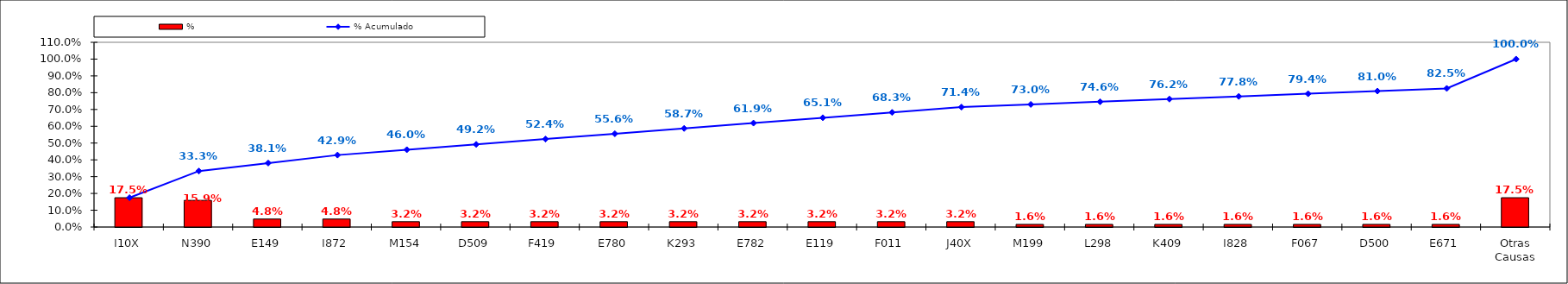
| Category | % |
|---|---|
| I10X | 0.175 |
| N390 | 0.159 |
| E149 | 0.048 |
| I872 | 0.048 |
| M154 | 0.032 |
| D509 | 0.032 |
| F419 | 0.032 |
| E780 | 0.032 |
| K293 | 0.032 |
| E782 | 0.032 |
| E119 | 0.032 |
| F011 | 0.032 |
| J40X | 0.032 |
| M199 | 0.016 |
| L298 | 0.016 |
| K409 | 0.016 |
| I828 | 0.016 |
| F067 | 0.016 |
| D500 | 0.016 |
| E671 | 0.016 |
| Otras Causas | 0.175 |